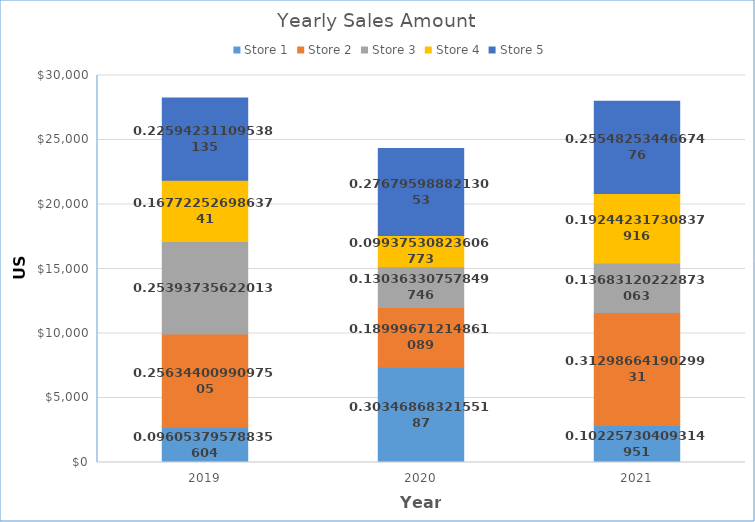
| Category | Store 1 | Store 2 | Store 3 | Store 4 | Store 5 |
|---|---|---|---|---|---|
| 2019.0 | 2714 | 7243 | 7175 | 4739 | 6384 |
| 2020.0 | 7384 | 4623 | 3172 | 2418 | 6735 |
| 2021.0 | 2863 | 8763 | 3831 | 5388 | 7153 |